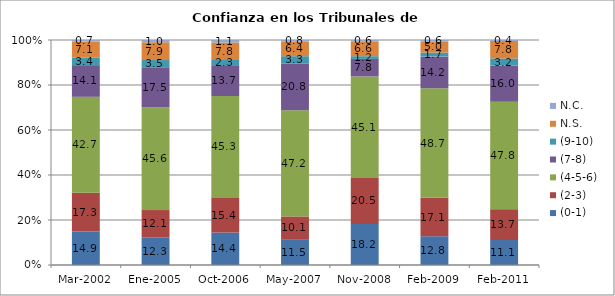
| Category | (0-1) | (2-3) | (4-5-6) | (7-8) | (9-10) | N.S. | N.C. |
|---|---|---|---|---|---|---|---|
| Mar-2002 | 14.9 | 17.3 | 42.7 | 14.1 | 3.4 | 7.1 | 0.7 |
| Ene-2005 | 12.3 | 12.1 | 45.6 | 17.5 | 3.5 | 7.9 | 1 |
| Oct-2006 | 14.4 | 15.4 | 45.3 | 13.7 | 2.3 | 7.8 | 1.1 |
| May-2007 | 11.5 | 10.1 | 47.2 | 20.8 | 3.3 | 6.4 | 0.8 |
| Nov-2008 | 18.2 | 20.5 | 45.1 | 7.8 | 1.2 | 6.6 | 0.6 |
| Feb-2009 | 12.8 | 17.1 | 48.7 | 14.2 | 1.7 | 5 | 0.6 |
| Feb-2011 | 11.1 | 13.7 | 47.8 | 16 | 3.2 | 7.8 | 0.4 |